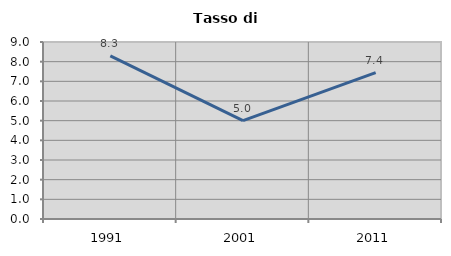
| Category | Tasso di disoccupazione   |
|---|---|
| 1991.0 | 8.298 |
| 2001.0 | 5 |
| 2011.0 | 7.446 |